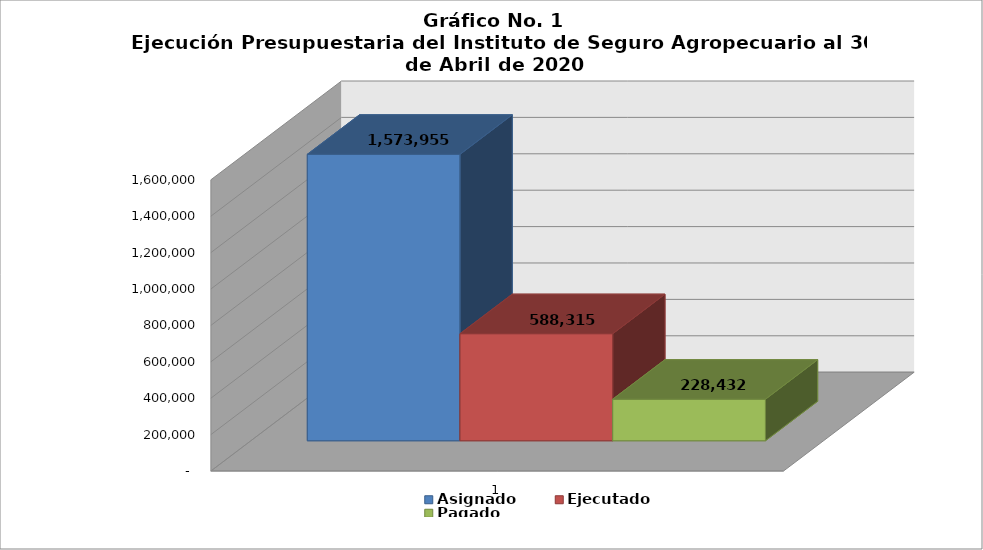
| Category | Asignado | Ejecutado | Pagado |
|---|---|---|---|
| 0 | 1573955 | 588314.76 | 228432.21 |